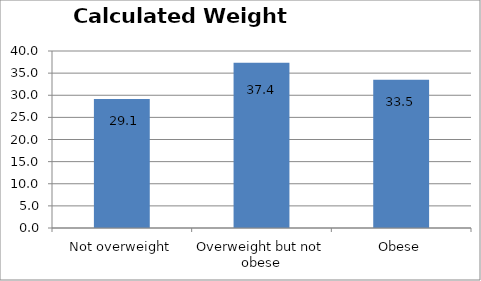
| Category | Series 0 |
|---|---|
| Not overweight | 29.145 |
| Overweight but not obese | 37.366 |
| Obese | 33.489 |